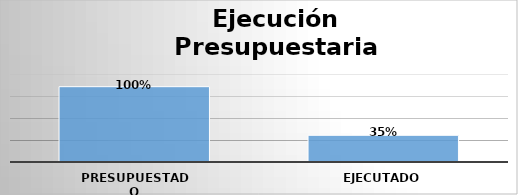
| Category | Series 0 |
|---|---|
| Presupuestado | 6846942708 |
| Ejecutado | 2427448272 |